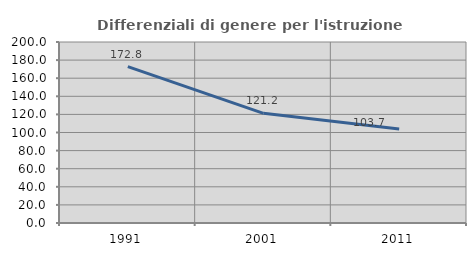
| Category | Differenziali di genere per l'istruzione superiore |
|---|---|
| 1991.0 | 172.82 |
| 2001.0 | 121.154 |
| 2011.0 | 103.746 |